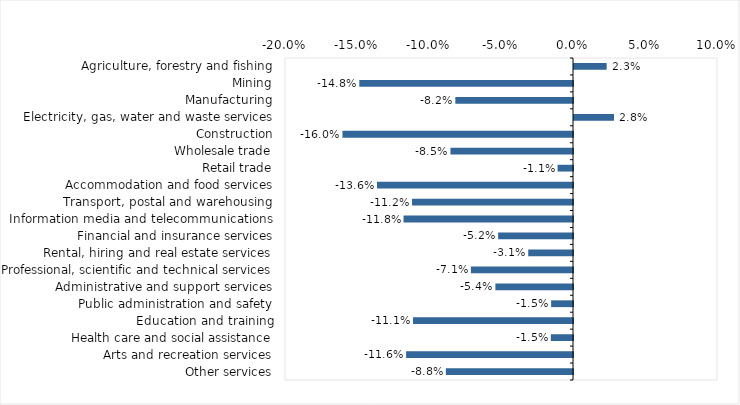
| Category | This week |
|---|---|
| Agriculture, forestry and fishing | 0.023 |
| Mining | -0.148 |
| Manufacturing | -0.082 |
| Electricity, gas, water and waste services | 0.028 |
| Construction | -0.16 |
| Wholesale trade | -0.085 |
| Retail trade | -0.011 |
| Accommodation and food services | -0.136 |
| Transport, postal and warehousing | -0.112 |
| Information media and telecommunications | -0.118 |
| Financial and insurance services | -0.052 |
| Rental, hiring and real estate services | -0.031 |
| Professional, scientific and technical services | -0.071 |
| Administrative and support services | -0.054 |
| Public administration and safety | -0.015 |
| Education and training | -0.111 |
| Health care and social assistance | -0.015 |
| Arts and recreation services | -0.116 |
| Other services | -0.088 |